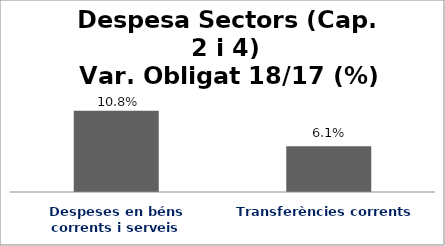
| Category | Series 0 |
|---|---|
| Despeses en béns corrents i serveis | 0.108 |
| Transferències corrents | 0.061 |